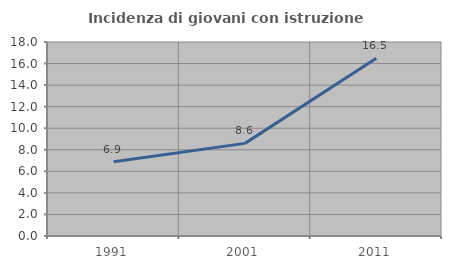
| Category | Incidenza di giovani con istruzione universitaria |
|---|---|
| 1991.0 | 6.897 |
| 2001.0 | 8.594 |
| 2011.0 | 16.5 |